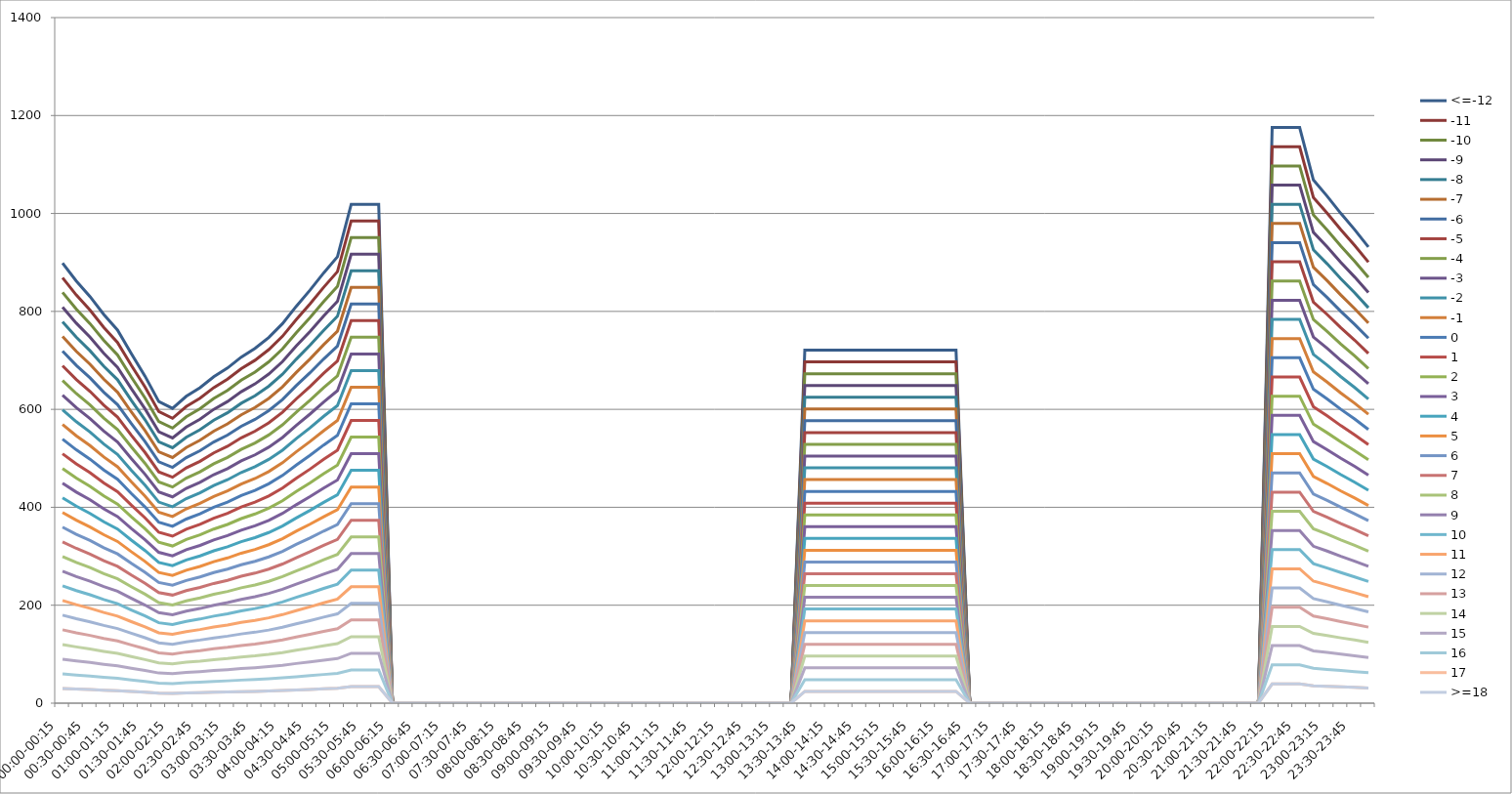
| Category | <=-12 | -11 | -10 | -9 | -8 | -7 | -6 | -5 | -4 | -3 | -2 | -1 | 0 | 1 | 2 | 3 | 4 | 5 | 6 | 7 | 8 | 9 | 10 | 11 | 12 | 13 | 14 | 15 | 16 | 17 | >=18 |
|---|---|---|---|---|---|---|---|---|---|---|---|---|---|---|---|---|---|---|---|---|---|---|---|---|---|---|---|---|---|---|---|
| 00:00-00:15 | 898.675 | 868.719 | 838.763 | 808.807 | 778.852 | 748.896 | 718.94 | 688.984 | 659.028 | 629.072 | 599.117 | 569.161 | 539.205 | 509.249 | 479.293 | 449.337 | 419.382 | 389.426 | 359.47 | 329.514 | 299.558 | 269.602 | 239.647 | 209.691 | 179.735 | 149.779 | 119.823 | 89.867 | 59.912 | 29.956 | 29.956 |
| 00:15-00:30 | 862.163 | 833.424 | 804.685 | 775.946 | 747.208 | 718.469 | 689.73 | 660.991 | 632.253 | 603.514 | 574.775 | 546.036 | 517.298 | 488.559 | 459.82 | 431.081 | 402.343 | 373.604 | 344.865 | 316.126 | 287.388 | 258.649 | 229.91 | 201.171 | 172.433 | 143.694 | 114.955 | 86.216 | 57.478 | 28.739 | 28.739 |
| 00:30-00:45 | 830.362 | 802.683 | 775.004 | 747.325 | 719.647 | 691.968 | 664.289 | 636.611 | 608.932 | 581.253 | 553.574 | 525.896 | 498.217 | 470.538 | 442.859 | 415.181 | 387.502 | 359.823 | 332.145 | 304.466 | 276.787 | 249.108 | 221.43 | 193.751 | 166.072 | 138.394 | 110.715 | 83.036 | 55.357 | 27.679 | 27.679 |
| 00:45-01:00 | 793.849 | 767.388 | 740.926 | 714.464 | 688.003 | 661.541 | 635.079 | 608.618 | 582.156 | 555.694 | 529.233 | 502.771 | 476.31 | 449.848 | 423.386 | 396.925 | 370.463 | 344.001 | 317.54 | 291.078 | 264.616 | 238.155 | 211.693 | 185.231 | 158.77 | 132.308 | 105.847 | 79.385 | 52.923 | 26.462 | 26.462 |
| 01:00-01:15 | 762.048 | 736.646 | 711.245 | 685.843 | 660.442 | 635.04 | 609.638 | 584.237 | 558.835 | 533.434 | 508.032 | 482.63 | 457.229 | 431.827 | 406.426 | 381.024 | 355.622 | 330.221 | 304.819 | 279.418 | 254.016 | 228.614 | 203.213 | 177.811 | 152.41 | 127.008 | 101.606 | 76.205 | 50.803 | 25.402 | 25.402 |
| 01:15-01:30 | 713.758 | 689.966 | 666.174 | 642.382 | 618.59 | 594.798 | 571.006 | 547.214 | 523.422 | 499.63 | 475.838 | 452.046 | 428.255 | 404.463 | 380.671 | 356.879 | 333.087 | 309.295 | 285.503 | 261.711 | 237.919 | 214.127 | 190.335 | 166.543 | 142.752 | 118.96 | 95.168 | 71.376 | 47.584 | 23.792 | 23.792 |
| 01:30-01:45 | 667.823 | 645.562 | 623.301 | 601.04 | 578.78 | 556.519 | 534.258 | 511.997 | 489.737 | 467.476 | 445.215 | 422.954 | 400.694 | 378.433 | 356.172 | 333.911 | 311.651 | 289.39 | 267.129 | 244.868 | 222.608 | 200.347 | 178.086 | 155.825 | 133.565 | 111.304 | 89.043 | 66.782 | 44.522 | 22.261 | 22.261 |
| 01:45-02:00 | 615.999 | 595.465 | 574.932 | 554.399 | 533.866 | 513.332 | 492.799 | 472.266 | 451.732 | 431.199 | 410.666 | 390.133 | 369.599 | 349.066 | 328.533 | 307.999 | 287.466 | 266.933 | 246.399 | 225.866 | 205.333 | 184.8 | 164.266 | 143.733 | 123.2 | 102.666 | 82.133 | 61.6 | 41.067 | 20.533 | 20.533 |
| 02:00-02:15 | 601.865 | 581.803 | 561.741 | 541.678 | 521.616 | 501.554 | 481.492 | 461.43 | 441.368 | 421.305 | 401.243 | 381.181 | 361.119 | 341.057 | 320.995 | 300.932 | 280.87 | 260.808 | 240.746 | 220.684 | 200.622 | 180.559 | 160.497 | 140.435 | 120.373 | 100.311 | 80.249 | 60.186 | 40.124 | 20.062 | 20.062 |
| 02:15-02:30 | 626.599 | 605.712 | 584.826 | 563.939 | 543.053 | 522.166 | 501.279 | 480.393 | 459.506 | 438.619 | 417.733 | 396.846 | 375.959 | 355.073 | 334.186 | 313.3 | 292.413 | 271.526 | 250.64 | 229.753 | 208.866 | 187.98 | 167.093 | 146.206 | 125.32 | 104.433 | 83.547 | 62.66 | 41.773 | 20.887 | 20.887 |
| 02:30-02:45 | 644.266 | 622.791 | 601.315 | 579.84 | 558.364 | 536.889 | 515.413 | 493.938 | 472.462 | 450.986 | 429.511 | 408.035 | 386.56 | 365.084 | 343.609 | 322.133 | 300.658 | 279.182 | 257.707 | 236.231 | 214.755 | 193.28 | 171.804 | 150.329 | 128.853 | 107.378 | 85.902 | 64.427 | 42.951 | 21.476 | 21.476 |
| 02:45-03:00 | 666.645 | 644.423 | 622.202 | 599.98 | 577.759 | 555.537 | 533.316 | 511.094 | 488.873 | 466.651 | 444.43 | 422.208 | 399.987 | 377.765 | 355.544 | 333.322 | 311.101 | 288.879 | 266.658 | 244.436 | 222.215 | 199.993 | 177.772 | 155.55 | 133.329 | 111.107 | 88.886 | 66.664 | 44.443 | 22.221 | 22.221 |
| 03:00-03:15 | 684.312 | 661.502 | 638.691 | 615.881 | 593.071 | 570.26 | 547.45 | 524.639 | 501.829 | 479.018 | 456.208 | 433.398 | 410.587 | 387.777 | 364.966 | 342.156 | 319.346 | 296.535 | 273.725 | 250.914 | 228.104 | 205.294 | 182.483 | 159.673 | 136.862 | 114.052 | 91.242 | 68.431 | 45.621 | 22.81 | 22.81 |
| 03:15-03:30 | 706.691 | 683.134 | 659.578 | 636.022 | 612.465 | 588.909 | 565.353 | 541.796 | 518.24 | 494.683 | 471.127 | 447.571 | 424.014 | 400.458 | 376.902 | 353.345 | 329.789 | 306.233 | 282.676 | 259.12 | 235.564 | 212.007 | 188.451 | 164.894 | 141.338 | 117.782 | 94.225 | 70.669 | 47.113 | 23.556 | 23.556 |
| 03:30-03:45 | 724.358 | 700.213 | 676.067 | 651.922 | 627.777 | 603.632 | 579.486 | 555.341 | 531.196 | 507.051 | 482.905 | 458.76 | 434.615 | 410.469 | 386.324 | 362.179 | 338.034 | 313.888 | 289.743 | 265.598 | 241.453 | 217.307 | 193.162 | 169.017 | 144.872 | 120.726 | 96.581 | 72.436 | 48.291 | 24.145 | 24.145 |
| 03:45-04:00 | 746.736 | 721.845 | 696.954 | 672.063 | 647.172 | 622.28 | 597.389 | 572.498 | 547.607 | 522.716 | 497.824 | 472.933 | 448.042 | 423.151 | 398.259 | 373.368 | 348.477 | 323.586 | 298.695 | 273.803 | 248.912 | 224.021 | 199.13 | 174.239 | 149.347 | 124.456 | 99.565 | 74.674 | 49.782 | 24.891 | 24.891 |
| 04:00-04:15 | 775.004 | 749.171 | 723.337 | 697.504 | 671.67 | 645.837 | 620.003 | 594.17 | 568.336 | 542.503 | 516.669 | 490.836 | 465.002 | 439.169 | 413.336 | 387.502 | 361.669 | 335.835 | 310.002 | 284.168 | 258.335 | 232.501 | 206.668 | 180.834 | 155.001 | 129.167 | 103.334 | 77.5 | 51.667 | 25.833 | 25.833 |
| 04:15-04:30 | 810.339 | 783.327 | 756.316 | 729.305 | 702.293 | 675.282 | 648.271 | 621.26 | 594.248 | 567.237 | 540.226 | 513.214 | 486.203 | 459.192 | 432.181 | 405.169 | 378.158 | 351.147 | 324.135 | 297.124 | 270.113 | 243.102 | 216.09 | 189.079 | 162.068 | 135.056 | 108.045 | 81.034 | 54.023 | 27.011 | 27.011 |
| 04:30-04:45 | 843.318 | 815.207 | 787.096 | 758.986 | 730.875 | 702.765 | 674.654 | 646.543 | 618.433 | 590.322 | 562.212 | 534.101 | 505.991 | 477.88 | 449.769 | 421.659 | 393.548 | 365.438 | 337.327 | 309.216 | 281.106 | 252.995 | 224.885 | 196.774 | 168.664 | 140.553 | 112.442 | 84.332 | 56.221 | 28.111 | 28.111 |
| 04:45-05:00 | 878.652 | 849.364 | 820.075 | 790.787 | 761.498 | 732.21 | 702.922 | 673.633 | 644.345 | 615.056 | 585.768 | 556.48 | 527.191 | 497.903 | 468.614 | 439.326 | 410.038 | 380.749 | 351.461 | 322.172 | 292.884 | 263.596 | 234.307 | 205.019 | 175.73 | 146.442 | 117.154 | 87.865 | 58.577 | 29.288 | 29.288 |
| 05:00-05:15 | 911.631 | 881.243 | 850.856 | 820.468 | 790.08 | 759.692 | 729.305 | 698.917 | 668.529 | 638.142 | 607.754 | 577.366 | 546.979 | 516.591 | 486.203 | 455.815 | 425.428 | 395.04 | 364.652 | 334.265 | 303.877 | 273.489 | 243.102 | 212.714 | 182.326 | 151.938 | 121.551 | 91.163 | 60.775 | 30.388 | 30.388 |
| 05:15-05:30 | 1018.812 | 984.852 | 950.892 | 916.931 | 882.971 | 849.01 | 815.05 | 781.089 | 747.129 | 713.169 | 679.208 | 645.248 | 611.287 | 577.327 | 543.367 | 509.406 | 475.446 | 441.485 | 407.525 | 373.565 | 339.604 | 305.644 | 271.683 | 237.723 | 203.762 | 169.802 | 135.842 | 101.881 | 67.921 | 33.96 | 33.96 |
| 05:30-05:45 | 1018.812 | 984.852 | 950.892 | 916.931 | 882.971 | 849.01 | 815.05 | 781.089 | 747.129 | 713.169 | 679.208 | 645.248 | 611.287 | 577.327 | 543.367 | 509.406 | 475.446 | 441.485 | 407.525 | 373.565 | 339.604 | 305.644 | 271.683 | 237.723 | 203.762 | 169.802 | 135.842 | 101.881 | 67.921 | 33.96 | 33.96 |
| 05:45-06:00 | 1018.812 | 984.852 | 950.892 | 916.931 | 882.971 | 849.01 | 815.05 | 781.089 | 747.129 | 713.169 | 679.208 | 645.248 | 611.287 | 577.327 | 543.367 | 509.406 | 475.446 | 441.485 | 407.525 | 373.565 | 339.604 | 305.644 | 271.683 | 237.723 | 203.762 | 169.802 | 135.842 | 101.881 | 67.921 | 33.96 | 33.96 |
| 06:00-06:15 | 0 | 0 | 0 | 0 | 0 | 0 | 0 | 0 | 0 | 0 | 0 | 0 | 0 | 0 | 0 | 0 | 0 | 0 | 0 | 0 | 0 | 0 | 0 | 0 | 0 | 0 | 0 | 0 | 0 | 0 | 0 |
| 06:15-06:30 | 0 | 0 | 0 | 0 | 0 | 0 | 0 | 0 | 0 | 0 | 0 | 0 | 0 | 0 | 0 | 0 | 0 | 0 | 0 | 0 | 0 | 0 | 0 | 0 | 0 | 0 | 0 | 0 | 0 | 0 | 0 |
| 06:30-06:45 | 0 | 0 | 0 | 0 | 0 | 0 | 0 | 0 | 0 | 0 | 0 | 0 | 0 | 0 | 0 | 0 | 0 | 0 | 0 | 0 | 0 | 0 | 0 | 0 | 0 | 0 | 0 | 0 | 0 | 0 | 0 |
| 06:45-07:00 | 0 | 0 | 0 | 0 | 0 | 0 | 0 | 0 | 0 | 0 | 0 | 0 | 0 | 0 | 0 | 0 | 0 | 0 | 0 | 0 | 0 | 0 | 0 | 0 | 0 | 0 | 0 | 0 | 0 | 0 | 0 |
| 07:00-07:15 | 0 | 0 | 0 | 0 | 0 | 0 | 0 | 0 | 0 | 0 | 0 | 0 | 0 | 0 | 0 | 0 | 0 | 0 | 0 | 0 | 0 | 0 | 0 | 0 | 0 | 0 | 0 | 0 | 0 | 0 | 0 |
| 07:15-07:30 | 0 | 0 | 0 | 0 | 0 | 0 | 0 | 0 | 0 | 0 | 0 | 0 | 0 | 0 | 0 | 0 | 0 | 0 | 0 | 0 | 0 | 0 | 0 | 0 | 0 | 0 | 0 | 0 | 0 | 0 | 0 |
| 07:30-07:45 | 0 | 0 | 0 | 0 | 0 | 0 | 0 | 0 | 0 | 0 | 0 | 0 | 0 | 0 | 0 | 0 | 0 | 0 | 0 | 0 | 0 | 0 | 0 | 0 | 0 | 0 | 0 | 0 | 0 | 0 | 0 |
| 07:45-08:00 | 0 | 0 | 0 | 0 | 0 | 0 | 0 | 0 | 0 | 0 | 0 | 0 | 0 | 0 | 0 | 0 | 0 | 0 | 0 | 0 | 0 | 0 | 0 | 0 | 0 | 0 | 0 | 0 | 0 | 0 | 0 |
| 08:00-08:15 | 0 | 0 | 0 | 0 | 0 | 0 | 0 | 0 | 0 | 0 | 0 | 0 | 0 | 0 | 0 | 0 | 0 | 0 | 0 | 0 | 0 | 0 | 0 | 0 | 0 | 0 | 0 | 0 | 0 | 0 | 0 |
| 08:15-08:30 | 0 | 0 | 0 | 0 | 0 | 0 | 0 | 0 | 0 | 0 | 0 | 0 | 0 | 0 | 0 | 0 | 0 | 0 | 0 | 0 | 0 | 0 | 0 | 0 | 0 | 0 | 0 | 0 | 0 | 0 | 0 |
| 08:30-08:45 | 0 | 0 | 0 | 0 | 0 | 0 | 0 | 0 | 0 | 0 | 0 | 0 | 0 | 0 | 0 | 0 | 0 | 0 | 0 | 0 | 0 | 0 | 0 | 0 | 0 | 0 | 0 | 0 | 0 | 0 | 0 |
| 08:45-09:00 | 0 | 0 | 0 | 0 | 0 | 0 | 0 | 0 | 0 | 0 | 0 | 0 | 0 | 0 | 0 | 0 | 0 | 0 | 0 | 0 | 0 | 0 | 0 | 0 | 0 | 0 | 0 | 0 | 0 | 0 | 0 |
| 09:00-09:15 | 0 | 0 | 0 | 0 | 0 | 0 | 0 | 0 | 0 | 0 | 0 | 0 | 0 | 0 | 0 | 0 | 0 | 0 | 0 | 0 | 0 | 0 | 0 | 0 | 0 | 0 | 0 | 0 | 0 | 0 | 0 |
| 09:15-09:30 | 0 | 0 | 0 | 0 | 0 | 0 | 0 | 0 | 0 | 0 | 0 | 0 | 0 | 0 | 0 | 0 | 0 | 0 | 0 | 0 | 0 | 0 | 0 | 0 | 0 | 0 | 0 | 0 | 0 | 0 | 0 |
| 09:30-09:45 | 0 | 0 | 0 | 0 | 0 | 0 | 0 | 0 | 0 | 0 | 0 | 0 | 0 | 0 | 0 | 0 | 0 | 0 | 0 | 0 | 0 | 0 | 0 | 0 | 0 | 0 | 0 | 0 | 0 | 0 | 0 |
| 09:45-10:00 | 0 | 0 | 0 | 0 | 0 | 0 | 0 | 0 | 0 | 0 | 0 | 0 | 0 | 0 | 0 | 0 | 0 | 0 | 0 | 0 | 0 | 0 | 0 | 0 | 0 | 0 | 0 | 0 | 0 | 0 | 0 |
| 10:00-10:15 | 0 | 0 | 0 | 0 | 0 | 0 | 0 | 0 | 0 | 0 | 0 | 0 | 0 | 0 | 0 | 0 | 0 | 0 | 0 | 0 | 0 | 0 | 0 | 0 | 0 | 0 | 0 | 0 | 0 | 0 | 0 |
| 10:15-10:30 | 0 | 0 | 0 | 0 | 0 | 0 | 0 | 0 | 0 | 0 | 0 | 0 | 0 | 0 | 0 | 0 | 0 | 0 | 0 | 0 | 0 | 0 | 0 | 0 | 0 | 0 | 0 | 0 | 0 | 0 | 0 |
| 10:30-10:45 | 0 | 0 | 0 | 0 | 0 | 0 | 0 | 0 | 0 | 0 | 0 | 0 | 0 | 0 | 0 | 0 | 0 | 0 | 0 | 0 | 0 | 0 | 0 | 0 | 0 | 0 | 0 | 0 | 0 | 0 | 0 |
| 10:45-11:00 | 0 | 0 | 0 | 0 | 0 | 0 | 0 | 0 | 0 | 0 | 0 | 0 | 0 | 0 | 0 | 0 | 0 | 0 | 0 | 0 | 0 | 0 | 0 | 0 | 0 | 0 | 0 | 0 | 0 | 0 | 0 |
| 11:00-11:15 | 0 | 0 | 0 | 0 | 0 | 0 | 0 | 0 | 0 | 0 | 0 | 0 | 0 | 0 | 0 | 0 | 0 | 0 | 0 | 0 | 0 | 0 | 0 | 0 | 0 | 0 | 0 | 0 | 0 | 0 | 0 |
| 11:15-11:30 | 0 | 0 | 0 | 0 | 0 | 0 | 0 | 0 | 0 | 0 | 0 | 0 | 0 | 0 | 0 | 0 | 0 | 0 | 0 | 0 | 0 | 0 | 0 | 0 | 0 | 0 | 0 | 0 | 0 | 0 | 0 |
| 11:30-11:45 | 0 | 0 | 0 | 0 | 0 | 0 | 0 | 0 | 0 | 0 | 0 | 0 | 0 | 0 | 0 | 0 | 0 | 0 | 0 | 0 | 0 | 0 | 0 | 0 | 0 | 0 | 0 | 0 | 0 | 0 | 0 |
| 11:45-12:00 | 0 | 0 | 0 | 0 | 0 | 0 | 0 | 0 | 0 | 0 | 0 | 0 | 0 | 0 | 0 | 0 | 0 | 0 | 0 | 0 | 0 | 0 | 0 | 0 | 0 | 0 | 0 | 0 | 0 | 0 | 0 |
| 12:00-12:15 | 0 | 0 | 0 | 0 | 0 | 0 | 0 | 0 | 0 | 0 | 0 | 0 | 0 | 0 | 0 | 0 | 0 | 0 | 0 | 0 | 0 | 0 | 0 | 0 | 0 | 0 | 0 | 0 | 0 | 0 | 0 |
| 12:15-12:30 | 0 | 0 | 0 | 0 | 0 | 0 | 0 | 0 | 0 | 0 | 0 | 0 | 0 | 0 | 0 | 0 | 0 | 0 | 0 | 0 | 0 | 0 | 0 | 0 | 0 | 0 | 0 | 0 | 0 | 0 | 0 |
| 12:30-12:45 | 0 | 0 | 0 | 0 | 0 | 0 | 0 | 0 | 0 | 0 | 0 | 0 | 0 | 0 | 0 | 0 | 0 | 0 | 0 | 0 | 0 | 0 | 0 | 0 | 0 | 0 | 0 | 0 | 0 | 0 | 0 |
| 12:45-13:00 | 0 | 0 | 0 | 0 | 0 | 0 | 0 | 0 | 0 | 0 | 0 | 0 | 0 | 0 | 0 | 0 | 0 | 0 | 0 | 0 | 0 | 0 | 0 | 0 | 0 | 0 | 0 | 0 | 0 | 0 | 0 |
| 13:00-13:15 | 0 | 0 | 0 | 0 | 0 | 0 | 0 | 0 | 0 | 0 | 0 | 0 | 0 | 0 | 0 | 0 | 0 | 0 | 0 | 0 | 0 | 0 | 0 | 0 | 0 | 0 | 0 | 0 | 0 | 0 | 0 |
| 13:15-13:30 | 0 | 0 | 0 | 0 | 0 | 0 | 0 | 0 | 0 | 0 | 0 | 0 | 0 | 0 | 0 | 0 | 0 | 0 | 0 | 0 | 0 | 0 | 0 | 0 | 0 | 0 | 0 | 0 | 0 | 0 | 0 |
| 13:30-13:45 | 720.824 | 696.797 | 672.77 | 648.742 | 624.715 | 600.687 | 576.66 | 552.632 | 528.605 | 504.577 | 480.55 | 456.522 | 432.495 | 408.467 | 384.44 | 360.412 | 336.385 | 312.357 | 288.33 | 264.302 | 240.275 | 216.247 | 192.22 | 168.192 | 144.165 | 120.137 | 96.11 | 72.082 | 48.055 | 24.027 | 24.027 |
| 13:45-14:00 | 720.824 | 696.797 | 672.77 | 648.742 | 624.715 | 600.687 | 576.66 | 552.632 | 528.605 | 504.577 | 480.55 | 456.522 | 432.495 | 408.467 | 384.44 | 360.412 | 336.385 | 312.357 | 288.33 | 264.302 | 240.275 | 216.247 | 192.22 | 168.192 | 144.165 | 120.137 | 96.11 | 72.082 | 48.055 | 24.027 | 24.027 |
| 14:00-14:15 | 720.824 | 696.797 | 672.77 | 648.742 | 624.715 | 600.687 | 576.66 | 552.632 | 528.605 | 504.577 | 480.55 | 456.522 | 432.495 | 408.467 | 384.44 | 360.412 | 336.385 | 312.357 | 288.33 | 264.302 | 240.275 | 216.247 | 192.22 | 168.192 | 144.165 | 120.137 | 96.11 | 72.082 | 48.055 | 24.027 | 24.027 |
| 14:15-14:30 | 720.824 | 696.797 | 672.77 | 648.742 | 624.715 | 600.687 | 576.66 | 552.632 | 528.605 | 504.577 | 480.55 | 456.522 | 432.495 | 408.467 | 384.44 | 360.412 | 336.385 | 312.357 | 288.33 | 264.302 | 240.275 | 216.247 | 192.22 | 168.192 | 144.165 | 120.137 | 96.11 | 72.082 | 48.055 | 24.027 | 24.027 |
| 14:30-14:45 | 720.824 | 696.797 | 672.77 | 648.742 | 624.715 | 600.687 | 576.66 | 552.632 | 528.605 | 504.577 | 480.55 | 456.522 | 432.495 | 408.467 | 384.44 | 360.412 | 336.385 | 312.357 | 288.33 | 264.302 | 240.275 | 216.247 | 192.22 | 168.192 | 144.165 | 120.137 | 96.11 | 72.082 | 48.055 | 24.027 | 24.027 |
| 14:45-15:00 | 720.824 | 696.797 | 672.77 | 648.742 | 624.715 | 600.687 | 576.66 | 552.632 | 528.605 | 504.577 | 480.55 | 456.522 | 432.495 | 408.467 | 384.44 | 360.412 | 336.385 | 312.357 | 288.33 | 264.302 | 240.275 | 216.247 | 192.22 | 168.192 | 144.165 | 120.137 | 96.11 | 72.082 | 48.055 | 24.027 | 24.027 |
| 15:00-15:15 | 720.824 | 696.797 | 672.77 | 648.742 | 624.715 | 600.687 | 576.66 | 552.632 | 528.605 | 504.577 | 480.55 | 456.522 | 432.495 | 408.467 | 384.44 | 360.412 | 336.385 | 312.357 | 288.33 | 264.302 | 240.275 | 216.247 | 192.22 | 168.192 | 144.165 | 120.137 | 96.11 | 72.082 | 48.055 | 24.027 | 24.027 |
| 15:15-15:30 | 720.824 | 696.797 | 672.77 | 648.742 | 624.715 | 600.687 | 576.66 | 552.632 | 528.605 | 504.577 | 480.55 | 456.522 | 432.495 | 408.467 | 384.44 | 360.412 | 336.385 | 312.357 | 288.33 | 264.302 | 240.275 | 216.247 | 192.22 | 168.192 | 144.165 | 120.137 | 96.11 | 72.082 | 48.055 | 24.027 | 24.027 |
| 15:30-15:45 | 720.824 | 696.797 | 672.77 | 648.742 | 624.715 | 600.687 | 576.66 | 552.632 | 528.605 | 504.577 | 480.55 | 456.522 | 432.495 | 408.467 | 384.44 | 360.412 | 336.385 | 312.357 | 288.33 | 264.302 | 240.275 | 216.247 | 192.22 | 168.192 | 144.165 | 120.137 | 96.11 | 72.082 | 48.055 | 24.027 | 24.027 |
| 15:45-16:00 | 720.824 | 696.797 | 672.77 | 648.742 | 624.715 | 600.687 | 576.66 | 552.632 | 528.605 | 504.577 | 480.55 | 456.522 | 432.495 | 408.467 | 384.44 | 360.412 | 336.385 | 312.357 | 288.33 | 264.302 | 240.275 | 216.247 | 192.22 | 168.192 | 144.165 | 120.137 | 96.11 | 72.082 | 48.055 | 24.027 | 24.027 |
| 16:00-16:15 | 720.824 | 696.797 | 672.77 | 648.742 | 624.715 | 600.687 | 576.66 | 552.632 | 528.605 | 504.577 | 480.55 | 456.522 | 432.495 | 408.467 | 384.44 | 360.412 | 336.385 | 312.357 | 288.33 | 264.302 | 240.275 | 216.247 | 192.22 | 168.192 | 144.165 | 120.137 | 96.11 | 72.082 | 48.055 | 24.027 | 24.027 |
| 16:15-16:30 | 720.824 | 696.797 | 672.77 | 648.742 | 624.715 | 600.687 | 576.66 | 552.632 | 528.605 | 504.577 | 480.55 | 456.522 | 432.495 | 408.467 | 384.44 | 360.412 | 336.385 | 312.357 | 288.33 | 264.302 | 240.275 | 216.247 | 192.22 | 168.192 | 144.165 | 120.137 | 96.11 | 72.082 | 48.055 | 24.027 | 24.027 |
| 16:30-16:45 | 0 | 0 | 0 | 0 | 0 | 0 | 0 | 0 | 0 | 0 | 0 | 0 | 0 | 0 | 0 | 0 | 0 | 0 | 0 | 0 | 0 | 0 | 0 | 0 | 0 | 0 | 0 | 0 | 0 | 0 | 0 |
| 16:45-17:00 | 0 | 0 | 0 | 0 | 0 | 0 | 0 | 0 | 0 | 0 | 0 | 0 | 0 | 0 | 0 | 0 | 0 | 0 | 0 | 0 | 0 | 0 | 0 | 0 | 0 | 0 | 0 | 0 | 0 | 0 | 0 |
| 17:00-17:15 | 0 | 0 | 0 | 0 | 0 | 0 | 0 | 0 | 0 | 0 | 0 | 0 | 0 | 0 | 0 | 0 | 0 | 0 | 0 | 0 | 0 | 0 | 0 | 0 | 0 | 0 | 0 | 0 | 0 | 0 | 0 |
| 17:15-17:30 | 0 | 0 | 0 | 0 | 0 | 0 | 0 | 0 | 0 | 0 | 0 | 0 | 0 | 0 | 0 | 0 | 0 | 0 | 0 | 0 | 0 | 0 | 0 | 0 | 0 | 0 | 0 | 0 | 0 | 0 | 0 |
| 17:30-17:45 | 0 | 0 | 0 | 0 | 0 | 0 | 0 | 0 | 0 | 0 | 0 | 0 | 0 | 0 | 0 | 0 | 0 | 0 | 0 | 0 | 0 | 0 | 0 | 0 | 0 | 0 | 0 | 0 | 0 | 0 | 0 |
| 17:45-18:00 | 0 | 0 | 0 | 0 | 0 | 0 | 0 | 0 | 0 | 0 | 0 | 0 | 0 | 0 | 0 | 0 | 0 | 0 | 0 | 0 | 0 | 0 | 0 | 0 | 0 | 0 | 0 | 0 | 0 | 0 | 0 |
| 18:00-18:15 | 0 | 0 | 0 | 0 | 0 | 0 | 0 | 0 | 0 | 0 | 0 | 0 | 0 | 0 | 0 | 0 | 0 | 0 | 0 | 0 | 0 | 0 | 0 | 0 | 0 | 0 | 0 | 0 | 0 | 0 | 0 |
| 18:15-18:30 | 0 | 0 | 0 | 0 | 0 | 0 | 0 | 0 | 0 | 0 | 0 | 0 | 0 | 0 | 0 | 0 | 0 | 0 | 0 | 0 | 0 | 0 | 0 | 0 | 0 | 0 | 0 | 0 | 0 | 0 | 0 |
| 18:30-18:45 | 0 | 0 | 0 | 0 | 0 | 0 | 0 | 0 | 0 | 0 | 0 | 0 | 0 | 0 | 0 | 0 | 0 | 0 | 0 | 0 | 0 | 0 | 0 | 0 | 0 | 0 | 0 | 0 | 0 | 0 | 0 |
| 18:45-19:00 | 0 | 0 | 0 | 0 | 0 | 0 | 0 | 0 | 0 | 0 | 0 | 0 | 0 | 0 | 0 | 0 | 0 | 0 | 0 | 0 | 0 | 0 | 0 | 0 | 0 | 0 | 0 | 0 | 0 | 0 | 0 |
| 19:00-19:15 | 0 | 0 | 0 | 0 | 0 | 0 | 0 | 0 | 0 | 0 | 0 | 0 | 0 | 0 | 0 | 0 | 0 | 0 | 0 | 0 | 0 | 0 | 0 | 0 | 0 | 0 | 0 | 0 | 0 | 0 | 0 |
| 19:15-19:30 | 0 | 0 | 0 | 0 | 0 | 0 | 0 | 0 | 0 | 0 | 0 | 0 | 0 | 0 | 0 | 0 | 0 | 0 | 0 | 0 | 0 | 0 | 0 | 0 | 0 | 0 | 0 | 0 | 0 | 0 | 0 |
| 19:30-19:45 | 0 | 0 | 0 | 0 | 0 | 0 | 0 | 0 | 0 | 0 | 0 | 0 | 0 | 0 | 0 | 0 | 0 | 0 | 0 | 0 | 0 | 0 | 0 | 0 | 0 | 0 | 0 | 0 | 0 | 0 | 0 |
| 19:45-20:00 | 0 | 0 | 0 | 0 | 0 | 0 | 0 | 0 | 0 | 0 | 0 | 0 | 0 | 0 | 0 | 0 | 0 | 0 | 0 | 0 | 0 | 0 | 0 | 0 | 0 | 0 | 0 | 0 | 0 | 0 | 0 |
| 20:00-20:15 | 0 | 0 | 0 | 0 | 0 | 0 | 0 | 0 | 0 | 0 | 0 | 0 | 0 | 0 | 0 | 0 | 0 | 0 | 0 | 0 | 0 | 0 | 0 | 0 | 0 | 0 | 0 | 0 | 0 | 0 | 0 |
| 20:15-20:30 | 0 | 0 | 0 | 0 | 0 | 0 | 0 | 0 | 0 | 0 | 0 | 0 | 0 | 0 | 0 | 0 | 0 | 0 | 0 | 0 | 0 | 0 | 0 | 0 | 0 | 0 | 0 | 0 | 0 | 0 | 0 |
| 20:30-20:45 | 0 | 0 | 0 | 0 | 0 | 0 | 0 | 0 | 0 | 0 | 0 | 0 | 0 | 0 | 0 | 0 | 0 | 0 | 0 | 0 | 0 | 0 | 0 | 0 | 0 | 0 | 0 | 0 | 0 | 0 | 0 |
| 20:45-21:00 | 0 | 0 | 0 | 0 | 0 | 0 | 0 | 0 | 0 | 0 | 0 | 0 | 0 | 0 | 0 | 0 | 0 | 0 | 0 | 0 | 0 | 0 | 0 | 0 | 0 | 0 | 0 | 0 | 0 | 0 | 0 |
| 21:00-21:15 | 0 | 0 | 0 | 0 | 0 | 0 | 0 | 0 | 0 | 0 | 0 | 0 | 0 | 0 | 0 | 0 | 0 | 0 | 0 | 0 | 0 | 0 | 0 | 0 | 0 | 0 | 0 | 0 | 0 | 0 | 0 |
| 21:15-21:30 | 0 | 0 | 0 | 0 | 0 | 0 | 0 | 0 | 0 | 0 | 0 | 0 | 0 | 0 | 0 | 0 | 0 | 0 | 0 | 0 | 0 | 0 | 0 | 0 | 0 | 0 | 0 | 0 | 0 | 0 | 0 |
| 21:30-21:45 | 0 | 0 | 0 | 0 | 0 | 0 | 0 | 0 | 0 | 0 | 0 | 0 | 0 | 0 | 0 | 0 | 0 | 0 | 0 | 0 | 0 | 0 | 0 | 0 | 0 | 0 | 0 | 0 | 0 | 0 | 0 |
| 21:45-22:00 | 0 | 0 | 0 | 0 | 0 | 0 | 0 | 0 | 0 | 0 | 0 | 0 | 0 | 0 | 0 | 0 | 0 | 0 | 0 | 0 | 0 | 0 | 0 | 0 | 0 | 0 | 0 | 0 | 0 | 0 | 0 |
| 22:00-22:15 | 1175.462 | 1136.28 | 1097.098 | 1057.916 | 1018.734 | 979.552 | 940.37 | 901.188 | 862.006 | 822.823 | 783.641 | 744.459 | 705.277 | 666.095 | 626.913 | 587.731 | 548.549 | 509.367 | 470.185 | 431.003 | 391.821 | 352.639 | 313.457 | 274.274 | 235.092 | 195.91 | 156.728 | 117.546 | 78.364 | 39.182 | 39.182 |
| 22:15-22:30 | 1175.462 | 1136.28 | 1097.098 | 1057.916 | 1018.734 | 979.552 | 940.37 | 901.188 | 862.006 | 822.823 | 783.641 | 744.459 | 705.277 | 666.095 | 626.913 | 587.731 | 548.549 | 509.367 | 470.185 | 431.003 | 391.821 | 352.639 | 313.457 | 274.274 | 235.092 | 195.91 | 156.728 | 117.546 | 78.364 | 39.182 | 39.182 |
| 22:30-22:45 | 1175.462 | 1136.28 | 1097.098 | 1057.916 | 1018.734 | 979.552 | 940.37 | 901.188 | 862.006 | 822.823 | 783.641 | 744.459 | 705.277 | 666.095 | 626.913 | 587.731 | 548.549 | 509.367 | 470.185 | 431.003 | 391.821 | 352.639 | 313.457 | 274.274 | 235.092 | 195.91 | 156.728 | 117.546 | 78.364 | 39.182 | 39.182 |
| 22:45-23:00 | 1068.281 | 1032.671 | 997.062 | 961.453 | 925.843 | 890.234 | 854.625 | 819.015 | 783.406 | 747.796 | 712.187 | 676.578 | 640.968 | 605.359 | 569.75 | 534.14 | 498.531 | 462.922 | 427.312 | 391.703 | 356.094 | 320.484 | 284.875 | 249.265 | 213.656 | 178.047 | 142.437 | 106.828 | 71.219 | 35.609 | 35.609 |
| 23:00-23:15 | 1035.302 | 1000.792 | 966.282 | 931.772 | 897.262 | 862.752 | 828.241 | 793.731 | 759.221 | 724.711 | 690.201 | 655.691 | 621.181 | 586.671 | 552.161 | 517.651 | 483.141 | 448.631 | 414.121 | 379.611 | 345.101 | 310.591 | 276.08 | 241.57 | 207.06 | 172.55 | 138.04 | 103.53 | 69.02 | 34.51 | 34.51 |
| 23:15-23:30 | 999.967 | 966.635 | 933.303 | 899.971 | 866.638 | 833.306 | 799.974 | 766.642 | 733.309 | 699.977 | 666.645 | 633.313 | 599.98 | 566.648 | 533.316 | 499.984 | 466.651 | 433.319 | 399.987 | 366.655 | 333.322 | 299.99 | 266.658 | 233.326 | 199.993 | 166.661 | 133.329 | 99.997 | 66.664 | 33.332 | 33.332 |
| 23:30-23:45 | 966.988 | 934.755 | 902.522 | 870.29 | 838.057 | 805.824 | 773.591 | 741.358 | 709.125 | 676.892 | 644.659 | 612.426 | 580.193 | 547.96 | 515.727 | 483.494 | 451.261 | 419.028 | 386.795 | 354.562 | 322.329 | 290.097 | 257.864 | 225.631 | 193.398 | 161.165 | 128.932 | 96.699 | 64.466 | 32.233 | 32.233 |
| 23:45-00:00 | 931.654 | 900.599 | 869.544 | 838.488 | 807.433 | 776.378 | 745.323 | 714.268 | 683.213 | 652.158 | 621.103 | 590.047 | 558.992 | 527.937 | 496.882 | 465.827 | 434.772 | 403.717 | 372.662 | 341.606 | 310.551 | 279.496 | 248.441 | 217.386 | 186.331 | 155.276 | 124.221 | 93.165 | 62.11 | 31.055 | 31.055 |